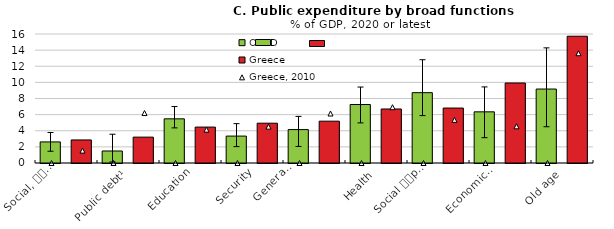
| Category | OECD | Greece |
|---|---|---|
| Social, 
culture and 
environment | 2.616 | 2.859 |
| Public debt¹ | 1.489 | 3.208 |
| Education | 5.478 | 4.454 |
| Security | 3.339 | 4.938 |
| General 
public 
services, excl. 
public debt | 4.145 | 5.187 |
| Health | 7.253 | 6.699 |
| Social 
protection
excl. old age | 8.724 | 6.814 |
| Economic
affairs | 6.345 | 9.923 |
| Old age | 9.174 | 15.723 |